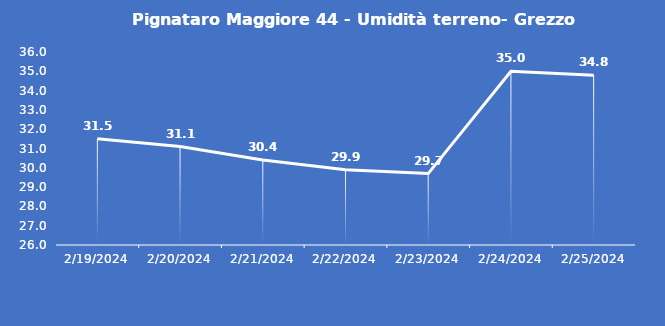
| Category | Pignataro Maggiore 44 - Umidità terreno- Grezzo (%VWC) |
|---|---|
| 2/19/24 | 31.5 |
| 2/20/24 | 31.1 |
| 2/21/24 | 30.4 |
| 2/22/24 | 29.9 |
| 2/23/24 | 29.7 |
| 2/24/24 | 35 |
| 2/25/24 | 34.8 |